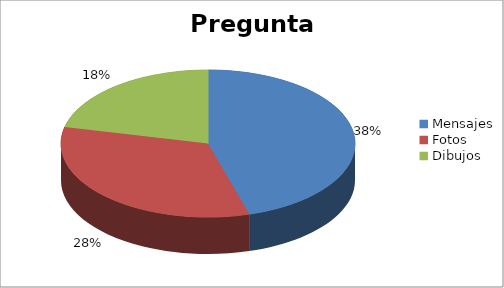
| Category | Series 0 |
|---|---|
| Mensajes | 0.378 |
| Fotos | 0.275 |
| Dibujos | 0.178 |